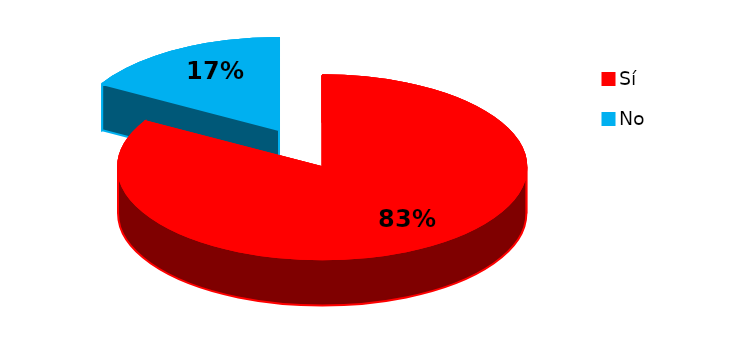
| Category | Series 0 |
|---|---|
| 0 | 15 |
| 1 | 3 |